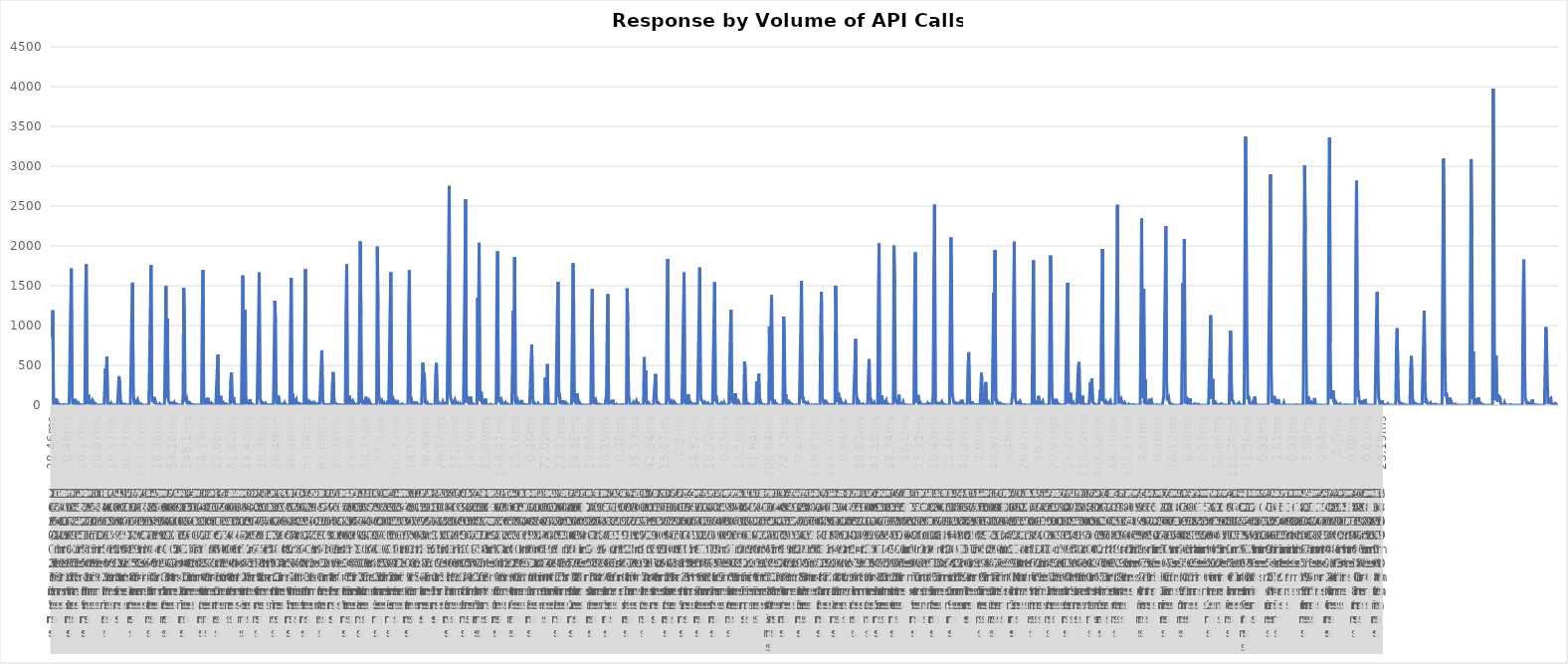
| Category | Number of Calls |
|---|---|
| 0 | 860 |
| 1 | 1191 |
| 2 | 26 |
| 3 | 37 |
| 4 | 39 |
| 5 | 9 |
| 6 | 81 |
| 7 | 19 |
| 8 | 1 |
| 9 | 22 |
| 10 | 27 |
| 11 | 3 |
| 12 | 1 |
| 13 | 3 |
| 14 | 8 |
| 15 | 4 |
| 16 | 1 |
| 17 | 9 |
| 18 | 4 |
| 19 | 1 |
| 20 | 1 |
| 21 | 1 |
| 22 | 1 |
| 23 | 1 |
| 24 | 43 |
| 25 | 48 |
| 26 | 1187 |
| 27 | 1716 |
| 28 | 130 |
| 29 | 8 |
| 30 | 33 |
| 31 | 8 |
| 32 | 78 |
| 33 | 14 |
| 34 | 31 |
| 35 | 1 |
| 36 | 13 |
| 37 | 27 |
| 38 | 5 |
| 39 | 5 |
| 40 | 6 |
| 41 | 1 |
| 42 | 2 |
| 43 | 1 |
| 44 | 1 |
| 45 | 1 |
| 46 | 2 |
| 47 | 1304 |
| 48 | 1770 |
| 49 | 12 |
| 50 | 17 |
| 51 | 132 |
| 52 | 77 |
| 53 | 34 |
| 54 | 2 |
| 55 | 4 |
| 56 | 47 |
| 57 | 1 |
| 58 | 39 |
| 59 | 18 |
| 60 | 1 |
| 61 | 19 |
| 62 | 12 |
| 63 | 3 |
| 64 | 1 |
| 65 | 1 |
| 66 | 9 |
| 67 | 1 |
| 68 | 1 |
| 69 | 4 |
| 70 | 1 |
| 71 | 1 |
| 72 | 1 |
| 73 | 1 |
| 74 | 1 |
| 75 | 460 |
| 76 | 123 |
| 77 | 610 |
| 78 | 22 |
| 79 | 27 |
| 80 | 21 |
| 81 | 17 |
| 82 | 1 |
| 83 | 23 |
| 84 | 5 |
| 85 | 3 |
| 86 | 4 |
| 87 | 4 |
| 88 | 4 |
| 89 | 1 |
| 90 | 1 |
| 91 | 2 |
| 92 | 1 |
| 93 | 7 |
| 94 | 364 |
| 95 | 281 |
| 96 | 82 |
| 97 | 1 |
| 98 | 25 |
| 99 | 26 |
| 100 | 1 |
| 101 | 1 |
| 102 | 13 |
| 103 | 1 |
| 104 | 5 |
| 105 | 1 |
| 106 | 4 |
| 107 | 7 |
| 108 | 3 |
| 109 | 1 |
| 110 | 1 |
| 111 | 1 |
| 112 | 1150 |
| 113 | 1539 |
| 114 | 156 |
| 115 | 68 |
| 116 | 12 |
| 117 | 13 |
| 118 | 4 |
| 119 | 53 |
| 120 | 69 |
| 121 | 11 |
| 122 | 28 |
| 123 | 7 |
| 124 | 5 |
| 125 | 15 |
| 126 | 1 |
| 127 | 1 |
| 128 | 2 |
| 129 | 1 |
| 130 | 1 |
| 131 | 3 |
| 132 | 1 |
| 133 | 13 |
| 134 | 2 |
| 135 | 1 |
| 136 | 1 |
| 137 | 1 |
| 138 | 1170 |
| 139 | 1760 |
| 140 | 144 |
| 141 | 40 |
| 142 | 40 |
| 143 | 102 |
| 144 | 20 |
| 145 | 51 |
| 146 | 19 |
| 147 | 29 |
| 148 | 9 |
| 149 | 16 |
| 150 | 1 |
| 151 | 17 |
| 152 | 2 |
| 153 | 1 |
| 154 | 3 |
| 155 | 2 |
| 156 | 1 |
| 157 | 1 |
| 158 | 2 |
| 159 | 2 |
| 160 | 1501 |
| 161 | 88 |
| 162 | 1087 |
| 163 | 93 |
| 164 | 41 |
| 165 | 46 |
| 166 | 15 |
| 167 | 6 |
| 168 | 31 |
| 169 | 35 |
| 170 | 27 |
| 171 | 1 |
| 172 | 28 |
| 173 | 5 |
| 174 | 12 |
| 175 | 15 |
| 176 | 3 |
| 177 | 2 |
| 178 | 2 |
| 179 | 2 |
| 180 | 1 |
| 181 | 1 |
| 182 | 1 |
| 183 | 1 |
| 184 | 115 |
| 185 | 1472 |
| 186 | 1030 |
| 187 | 43 |
| 188 | 45 |
| 189 | 80 |
| 190 | 12 |
| 191 | 52 |
| 192 | 10 |
| 193 | 21 |
| 194 | 26 |
| 195 | 25 |
| 196 | 5 |
| 197 | 3 |
| 198 | 5 |
| 199 | 6 |
| 200 | 4 |
| 201 | 1 |
| 202 | 2 |
| 203 | 2 |
| 204 | 1 |
| 205 | 1 |
| 206 | 2 |
| 207 | 1 |
| 208 | 1 |
| 209 | 1 |
| 210 | 1 |
| 211 | 1181 |
| 212 | 1697 |
| 213 | 56 |
| 214 | 86 |
| 215 | 1 |
| 216 | 58 |
| 217 | 23 |
| 218 | 26 |
| 219 | 92 |
| 220 | 17 |
| 221 | 32 |
| 222 | 22 |
| 223 | 5 |
| 224 | 24 |
| 225 | 19 |
| 226 | 4 |
| 227 | 2 |
| 228 | 1 |
| 229 | 1 |
| 230 | 1 |
| 231 | 2 |
| 232 | 443 |
| 233 | 634 |
| 234 | 14 |
| 235 | 21 |
| 236 | 1 |
| 237 | 116 |
| 238 | 3 |
| 239 | 2 |
| 240 | 5 |
| 241 | 29 |
| 242 | 27 |
| 243 | 7 |
| 244 | 9 |
| 245 | 15 |
| 246 | 2 |
| 247 | 1 |
| 248 | 1 |
| 249 | 1 |
| 250 | 2 |
| 251 | 313 |
| 252 | 411 |
| 253 | 28 |
| 254 | 27 |
| 255 | 101 |
| 256 | 15 |
| 257 | 5 |
| 258 | 4 |
| 259 | 7 |
| 260 | 4 |
| 261 | 7 |
| 262 | 2 |
| 263 | 4 |
| 264 | 1 |
| 265 | 1 |
| 266 | 1 |
| 267 | 1 |
| 268 | 1629 |
| 269 | 1 |
| 270 | 1 |
| 271 | 1199 |
| 272 | 164 |
| 273 | 31 |
| 274 | 35 |
| 275 | 29 |
| 276 | 13 |
| 277 | 11 |
| 278 | 73 |
| 279 | 5 |
| 280 | 25 |
| 281 | 13 |
| 282 | 5 |
| 283 | 6 |
| 284 | 1 |
| 285 | 1 |
| 286 | 1 |
| 287 | 1 |
| 288 | 2 |
| 289 | 1 |
| 290 | 1047 |
| 291 | 1667 |
| 292 | 98 |
| 293 | 87 |
| 294 | 18 |
| 295 | 39 |
| 296 | 48 |
| 297 | 18 |
| 298 | 13 |
| 299 | 10 |
| 300 | 24 |
| 301 | 9 |
| 302 | 9 |
| 303 | 5 |
| 304 | 2 |
| 305 | 1 |
| 306 | 5 |
| 307 | 5 |
| 308 | 1 |
| 309 | 1 |
| 310 | 1 |
| 311 | 2 |
| 312 | 1 |
| 313 | 1310 |
| 314 | 1023 |
| 315 | 39 |
| 316 | 39 |
| 317 | 13 |
| 318 | 119 |
| 319 | 51 |
| 320 | 19 |
| 321 | 23 |
| 322 | 4 |
| 323 | 9 |
| 324 | 16 |
| 325 | 5 |
| 326 | 3 |
| 327 | 26 |
| 328 | 4 |
| 329 | 3 |
| 330 | 1 |
| 331 | 1 |
| 332 | 1 |
| 333 | 1 |
| 334 | 1 |
| 335 | 980 |
| 336 | 1597 |
| 337 | 4 |
| 338 | 145 |
| 339 | 75 |
| 340 | 14 |
| 341 | 35 |
| 342 | 27 |
| 343 | 69 |
| 344 | 1 |
| 345 | 10 |
| 346 | 7 |
| 347 | 23 |
| 348 | 23 |
| 349 | 15 |
| 350 | 2 |
| 351 | 1 |
| 352 | 5 |
| 353 | 6 |
| 354 | 4 |
| 355 | 1001 |
| 356 | 1708 |
| 357 | 2 |
| 358 | 72 |
| 359 | 56 |
| 360 | 13 |
| 361 | 9 |
| 362 | 41 |
| 363 | 51 |
| 364 | 1 |
| 365 | 1 |
| 366 | 30 |
| 367 | 35 |
| 368 | 6 |
| 369 | 26 |
| 370 | 6 |
| 371 | 2 |
| 372 | 1 |
| 373 | 14 |
| 374 | 1 |
| 375 | 1 |
| 376 | 1 |
| 377 | 1 |
| 378 | 458 |
| 379 | 689 |
| 380 | 106 |
| 381 | 27 |
| 382 | 30 |
| 383 | 5 |
| 384 | 13 |
| 385 | 7 |
| 386 | 12 |
| 387 | 5 |
| 388 | 13 |
| 389 | 10 |
| 390 | 4 |
| 391 | 3 |
| 392 | 2 |
| 393 | 3 |
| 394 | 279 |
| 395 | 416 |
| 396 | 105 |
| 397 | 25 |
| 398 | 17 |
| 399 | 21 |
| 400 | 3 |
| 401 | 4 |
| 402 | 6 |
| 403 | 6 |
| 404 | 1 |
| 405 | 5 |
| 406 | 5 |
| 407 | 6 |
| 408 | 1 |
| 409 | 1 |
| 410 | 1 |
| 411 | 1 |
| 412 | 1 |
| 413 | 1173 |
| 414 | 1768 |
| 415 | 4 |
| 416 | 35 |
| 417 | 37 |
| 418 | 119 |
| 419 | 22 |
| 420 | 7 |
| 421 | 68 |
| 422 | 4 |
| 423 | 44 |
| 424 | 26 |
| 425 | 1 |
| 426 | 9 |
| 427 | 4 |
| 428 | 3 |
| 429 | 15 |
| 430 | 3 |
| 431 | 1 |
| 432 | 3 |
| 433 | 2056 |
| 434 | 1133 |
| 435 | 25 |
| 436 | 61 |
| 437 | 17 |
| 438 | 32 |
| 439 | 64 |
| 440 | 6 |
| 441 | 105 |
| 442 | 5 |
| 443 | 5 |
| 444 | 45 |
| 445 | 11 |
| 446 | 45 |
| 447 | 33 |
| 448 | 1 |
| 449 | 3 |
| 450 | 2 |
| 451 | 1 |
| 452 | 1 |
| 453 | 1 |
| 454 | 2 |
| 455 | 1 |
| 456 | 3 |
| 457 | 1991 |
| 458 | 1180 |
| 459 | 139 |
| 460 | 82 |
| 461 | 29 |
| 462 | 38 |
| 463 | 56 |
| 464 | 10 |
| 465 | 55 |
| 466 | 16 |
| 467 | 3 |
| 468 | 15 |
| 469 | 10 |
| 470 | 24 |
| 471 | 2 |
| 472 | 2 |
| 473 | 4 |
| 474 | 3 |
| 475 | 1212 |
| 476 | 1669 |
| 477 | 4 |
| 478 | 124 |
| 479 | 39 |
| 480 | 12 |
| 481 | 48 |
| 482 | 54 |
| 483 | 10 |
| 484 | 2 |
| 485 | 64 |
| 486 | 8 |
| 487 | 13 |
| 488 | 2 |
| 489 | 1 |
| 490 | 4 |
| 491 | 12 |
| 492 | 14 |
| 493 | 4 |
| 494 | 1 |
| 495 | 2 |
| 496 | 1 |
| 497 | 3 |
| 498 | 1 |
| 499 | 1 |
| 500 | 1 |
| 501 | 1244 |
| 502 | 1693 |
| 503 | 149 |
| 504 | 51 |
| 505 | 65 |
| 506 | 16 |
| 507 | 29 |
| 508 | 36 |
| 509 | 6 |
| 510 | 25 |
| 511 | 11 |
| 512 | 44 |
| 513 | 1 |
| 514 | 10 |
| 515 | 5 |
| 516 | 1 |
| 517 | 1 |
| 518 | 1 |
| 519 | 1 |
| 520 | 1 |
| 521 | 533 |
| 522 | 130 |
| 523 | 411 |
| 524 | 35 |
| 525 | 33 |
| 526 | 16 |
| 527 | 32 |
| 528 | 17 |
| 529 | 6 |
| 530 | 1 |
| 531 | 1 |
| 532 | 9 |
| 533 | 4 |
| 534 | 2 |
| 535 | 1 |
| 536 | 1 |
| 537 | 1 |
| 538 | 1 |
| 539 | 395 |
| 540 | 530 |
| 541 | 119 |
| 542 | 4 |
| 543 | 46 |
| 544 | 3 |
| 545 | 3 |
| 546 | 3 |
| 547 | 1 |
| 548 | 3 |
| 549 | 39 |
| 550 | 12 |
| 551 | 14 |
| 552 | 21 |
| 553 | 1 |
| 554 | 1 |
| 555 | 1 |
| 556 | 1 |
| 557 | 1779 |
| 558 | 2754 |
| 559 | 168 |
| 560 | 90 |
| 561 | 62 |
| 562 | 74 |
| 563 | 3 |
| 564 | 21 |
| 565 | 42 |
| 566 | 67 |
| 567 | 40 |
| 568 | 1 |
| 569 | 12 |
| 570 | 24 |
| 571 | 1 |
| 572 | 1 |
| 573 | 22 |
| 574 | 1 |
| 575 | 5 |
| 576 | 3 |
| 577 | 6 |
| 578 | 4 |
| 579 | 1 |
| 580 | 1613 |
| 581 | 2588 |
| 582 | 34 |
| 583 | 114 |
| 584 | 65 |
| 585 | 65 |
| 586 | 12 |
| 587 | 28 |
| 588 | 109 |
| 589 | 18 |
| 590 | 19 |
| 591 | 20 |
| 592 | 30 |
| 593 | 6 |
| 594 | 6 |
| 595 | 2 |
| 596 | 3 |
| 597 | 6 |
| 598 | 1351 |
| 599 | 136 |
| 600 | 2039 |
| 601 | 77 |
| 602 | 48 |
| 603 | 168 |
| 604 | 44 |
| 605 | 14 |
| 606 | 22 |
| 607 | 15 |
| 608 | 51 |
| 609 | 81 |
| 610 | 1 |
| 611 | 12 |
| 612 | 3 |
| 613 | 7 |
| 614 | 1 |
| 615 | 5 |
| 616 | 10 |
| 617 | 1 |
| 618 | 1 |
| 619 | 1 |
| 620 | 1 |
| 621 | 1 |
| 622 | 1 |
| 623 | 1 |
| 624 | 1 |
| 625 | 1409 |
| 626 | 1932 |
| 627 | 160 |
| 628 | 35 |
| 629 | 37 |
| 630 | 101 |
| 631 | 9 |
| 632 | 49 |
| 633 | 22 |
| 634 | 1 |
| 635 | 2 |
| 636 | 16 |
| 637 | 31 |
| 638 | 1 |
| 639 | 4 |
| 640 | 15 |
| 641 | 16 |
| 642 | 2 |
| 643 | 1 |
| 644 | 4 |
| 645 | 1 |
| 646 | 1 |
| 647 | 1 |
| 648 | 1181 |
| 649 | 142 |
| 650 | 1863 |
| 651 | 56 |
| 652 | 16 |
| 653 | 23 |
| 654 | 60 |
| 655 | 24 |
| 656 | 15 |
| 657 | 10 |
| 658 | 54 |
| 659 | 5 |
| 660 | 64 |
| 661 | 2 |
| 662 | 1 |
| 663 | 5 |
| 664 | 4 |
| 665 | 5 |
| 666 | 1 |
| 667 | 6 |
| 668 | 1 |
| 669 | 1 |
| 670 | 2 |
| 671 | 1 |
| 672 | 1 |
| 673 | 530 |
| 674 | 761 |
| 675 | 147 |
| 676 | 34 |
| 677 | 10 |
| 678 | 26 |
| 679 | 14 |
| 680 | 5 |
| 681 | 5 |
| 682 | 2 |
| 683 | 22 |
| 684 | 9 |
| 685 | 1 |
| 686 | 1 |
| 687 | 4 |
| 688 | 1 |
| 689 | 3 |
| 690 | 1 |
| 691 | 1 |
| 692 | 3 |
| 693 | 344 |
| 694 | 20 |
| 695 | 96 |
| 696 | 515 |
| 697 | 4 |
| 698 | 21 |
| 699 | 13 |
| 700 | 9 |
| 701 | 9 |
| 702 | 6 |
| 703 | 3 |
| 704 | 6 |
| 705 | 13 |
| 706 | 1 |
| 707 | 2 |
| 708 | 1 |
| 709 | 1 |
| 710 | 1226 |
| 711 | 1549 |
| 712 | 105 |
| 713 | 149 |
| 714 | 32 |
| 715 | 27 |
| 716 | 31 |
| 717 | 4 |
| 718 | 60 |
| 719 | 50 |
| 720 | 11 |
| 721 | 7 |
| 722 | 32 |
| 723 | 19 |
| 724 | 3 |
| 725 | 2 |
| 726 | 2 |
| 727 | 1 |
| 728 | 1 |
| 729 | 1 |
| 730 | 1 |
| 731 | 1 |
| 732 | 1781 |
| 733 | 1222 |
| 734 | 53 |
| 735 | 47 |
| 736 | 27 |
| 737 | 89 |
| 738 | 147 |
| 739 | 34 |
| 740 | 17 |
| 741 | 34 |
| 742 | 18 |
| 743 | 2 |
| 744 | 9 |
| 745 | 3 |
| 746 | 12 |
| 747 | 2 |
| 748 | 1 |
| 749 | 1 |
| 750 | 1 |
| 751 | 1 |
| 752 | 1 |
| 753 | 1 |
| 754 | 1 |
| 755 | 3 |
| 756 | 2 |
| 757 | 5 |
| 758 | 1027 |
| 759 | 1458 |
| 760 | 149 |
| 761 | 18 |
| 762 | 61 |
| 763 | 38 |
| 764 | 58 |
| 765 | 14 |
| 766 | 20 |
| 767 | 12 |
| 768 | 13 |
| 769 | 12 |
| 770 | 6 |
| 771 | 1 |
| 772 | 2 |
| 773 | 2 |
| 774 | 4 |
| 775 | 1 |
| 776 | 1 |
| 777 | 2 |
| 778 | 1 |
| 779 | 135 |
| 780 | 974 |
| 781 | 1393 |
| 782 | 12 |
| 783 | 26 |
| 784 | 28 |
| 785 | 42 |
| 786 | 43 |
| 787 | 29 |
| 788 | 69 |
| 789 | 4 |
| 790 | 9 |
| 791 | 1 |
| 792 | 4 |
| 793 | 12 |
| 794 | 3 |
| 795 | 3 |
| 796 | 8 |
| 797 | 1 |
| 798 | 1 |
| 799 | 1 |
| 800 | 1 |
| 801 | 9 |
| 802 | 2 |
| 803 | 2 |
| 804 | 1 |
| 805 | 1 |
| 806 | 1 |
| 807 | 1 |
| 808 | 1465 |
| 809 | 1058 |
| 810 | 145 |
| 811 | 66 |
| 812 | 9 |
| 813 | 3 |
| 814 | 3 |
| 815 | 2 |
| 816 | 7 |
| 817 | 36 |
| 818 | 38 |
| 819 | 7 |
| 820 | 4 |
| 821 | 51 |
| 822 | 13 |
| 823 | 16 |
| 824 | 23 |
| 825 | 1 |
| 826 | 1 |
| 827 | 1 |
| 828 | 1 |
| 829 | 1 |
| 830 | 1 |
| 831 | 1 |
| 832 | 602 |
| 833 | 115 |
| 834 | 434 |
| 835 | 42 |
| 836 | 9 |
| 837 | 5 |
| 838 | 31 |
| 839 | 11 |
| 840 | 23 |
| 841 | 2 |
| 842 | 1 |
| 843 | 1 |
| 844 | 1 |
| 845 | 5 |
| 846 | 7 |
| 847 | 280 |
| 848 | 391 |
| 849 | 96 |
| 850 | 27 |
| 851 | 22 |
| 852 | 30 |
| 853 | 12 |
| 854 | 1 |
| 855 | 4 |
| 856 | 1 |
| 857 | 1 |
| 858 | 1 |
| 859 | 1 |
| 860 | 1 |
| 861 | 1 |
| 862 | 2 |
| 863 | 3 |
| 864 | 1196 |
| 865 | 1836 |
| 866 | 141 |
| 867 | 68 |
| 868 | 30 |
| 869 | 39 |
| 870 | 50 |
| 871 | 8 |
| 872 | 6 |
| 873 | 36 |
| 874 | 12 |
| 875 | 32 |
| 876 | 33 |
| 877 | 3 |
| 878 | 3 |
| 879 | 3 |
| 880 | 5 |
| 881 | 1 |
| 882 | 1 |
| 883 | 2 |
| 884 | 1 |
| 885 | 2 |
| 886 | 1 |
| 887 | 1097 |
| 888 | 1667 |
| 889 | 48 |
| 890 | 58 |
| 891 | 5 |
| 892 | 62 |
| 893 | 9 |
| 894 | 138 |
| 895 | 12 |
| 896 | 17 |
| 897 | 41 |
| 898 | 33 |
| 899 | 17 |
| 900 | 5 |
| 901 | 1 |
| 902 | 3 |
| 903 | 16 |
| 904 | 5 |
| 905 | 1 |
| 906 | 1 |
| 907 | 1 |
| 908 | 2 |
| 909 | 1104 |
| 910 | 1729 |
| 911 | 174 |
| 912 | 69 |
| 913 | 65 |
| 914 | 48 |
| 915 | 22 |
| 916 | 12 |
| 917 | 38 |
| 918 | 1 |
| 919 | 22 |
| 920 | 13 |
| 921 | 3 |
| 922 | 23 |
| 923 | 33 |
| 924 | 1 |
| 925 | 1 |
| 926 | 6 |
| 927 | 3 |
| 928 | 7 |
| 929 | 1 |
| 930 | 1045 |
| 931 | 1545 |
| 932 | 51 |
| 933 | 119 |
| 934 | 32 |
| 935 | 36 |
| 936 | 9 |
| 937 | 7 |
| 938 | 3 |
| 939 | 13 |
| 940 | 27 |
| 941 | 3 |
| 942 | 11 |
| 943 | 11 |
| 944 | 32 |
| 945 | 1 |
| 946 | 6 |
| 947 | 2 |
| 948 | 7 |
| 949 | 1 |
| 950 | 1 |
| 951 | 2 |
| 952 | 1 |
| 953 | 896 |
| 954 | 1196 |
| 955 | 70 |
| 956 | 24 |
| 957 | 50 |
| 958 | 37 |
| 959 | 1 |
| 960 | 148 |
| 961 | 8 |
| 962 | 20 |
| 963 | 41 |
| 964 | 8 |
| 965 | 35 |
| 966 | 9 |
| 967 | 9 |
| 968 | 1 |
| 969 | 1 |
| 970 | 1 |
| 971 | 1 |
| 972 | 1 |
| 973 | 546 |
| 974 | 421 |
| 975 | 105 |
| 976 | 7 |
| 977 | 24 |
| 978 | 18 |
| 979 | 19 |
| 980 | 11 |
| 981 | 1 |
| 982 | 1 |
| 983 | 1 |
| 984 | 9 |
| 985 | 6 |
| 986 | 5 |
| 987 | 1 |
| 988 | 1 |
| 989 | 1 |
| 990 | 300 |
| 991 | 30 |
| 992 | 110 |
| 993 | 393 |
| 994 | 27 |
| 995 | 2 |
| 996 | 36 |
| 997 | 10 |
| 998 | 1 |
| 999 | 1 |
| 1000 | 1 |
| 1001 | 7 |
| 1002 | 6 |
| 1003 | 3 |
| 1004 | 1 |
| 1005 | 1 |
| 1006 | 1 |
| 1007 | 1 |
| 1008 | 987 |
| 1009 | 53 |
| 1010 | 48 |
| 1011 | 1380 |
| 1012 | 124 |
| 1013 | 9 |
| 1014 | 30 |
| 1015 | 66 |
| 1016 | 24 |
| 1017 | 17 |
| 1018 | 20 |
| 1019 | 4 |
| 1020 | 2 |
| 1021 | 1 |
| 1022 | 10 |
| 1023 | 1 |
| 1024 | 7 |
| 1025 | 1 |
| 1026 | 3 |
| 1027 | 4 |
| 1028 | 1112 |
| 1029 | 786 |
| 1030 | 41 |
| 1031 | 137 |
| 1032 | 21 |
| 1033 | 27 |
| 1034 | 42 |
| 1035 | 26 |
| 1036 | 41 |
| 1037 | 29 |
| 1038 | 10 |
| 1039 | 3 |
| 1040 | 14 |
| 1041 | 3 |
| 1042 | 1 |
| 1043 | 1 |
| 1044 | 1 |
| 1045 | 4 |
| 1046 | 3 |
| 1047 | 1 |
| 1048 | 1 |
| 1049 | 1 |
| 1050 | 1 |
| 1051 | 1 |
| 1052 | 986 |
| 1053 | 1558 |
| 1054 | 77 |
| 1055 | 103 |
| 1056 | 38 |
| 1057 | 37 |
| 1058 | 41 |
| 1059 | 34 |
| 1060 | 14 |
| 1061 | 8 |
| 1062 | 32 |
| 1063 | 7 |
| 1064 | 6 |
| 1065 | 4 |
| 1066 | 6 |
| 1067 | 5 |
| 1068 | 9 |
| 1069 | 1 |
| 1070 | 1 |
| 1071 | 1 |
| 1072 | 2 |
| 1073 | 5 |
| 1074 | 1 |
| 1075 | 4 |
| 1076 | 1 |
| 1077 | 1 |
| 1078 | 1 |
| 1079 | 1 |
| 1080 | 1007 |
| 1081 | 1423 |
| 1082 | 111 |
| 1083 | 68 |
| 1084 | 36 |
| 1085 | 8 |
| 1086 | 36 |
| 1087 | 21 |
| 1088 | 41 |
| 1089 | 45 |
| 1090 | 15 |
| 1091 | 14 |
| 1092 | 3 |
| 1093 | 13 |
| 1094 | 8 |
| 1095 | 4 |
| 1096 | 10 |
| 1097 | 4 |
| 1098 | 1 |
| 1099 | 1 |
| 1100 | 1 |
| 1101 | 1501 |
| 1102 | 1075 |
| 1103 | 40 |
| 1104 | 49 |
| 1105 | 157 |
| 1106 | 24 |
| 1107 | 17 |
| 1108 | 55 |
| 1109 | 4 |
| 1110 | 29 |
| 1111 | 32 |
| 1112 | 5 |
| 1113 | 1 |
| 1114 | 4 |
| 1115 | 33 |
| 1116 | 9 |
| 1117 | 1 |
| 1118 | 1 |
| 1119 | 9 |
| 1120 | 7 |
| 1121 | 1 |
| 1122 | 1 |
| 1123 | 1 |
| 1124 | 1 |
| 1125 | 1 |
| 1126 | 1 |
| 1127 | 1 |
| 1128 | 499 |
| 1129 | 830 |
| 1130 | 152 |
| 1131 | 39 |
| 1132 | 56 |
| 1133 | 17 |
| 1134 | 33 |
| 1135 | 5 |
| 1136 | 2 |
| 1137 | 1 |
| 1138 | 3 |
| 1139 | 17 |
| 1140 | 10 |
| 1141 | 1 |
| 1142 | 3 |
| 1143 | 4 |
| 1144 | 1 |
| 1145 | 2 |
| 1146 | 23 |
| 1147 | 361 |
| 1148 | 577 |
| 1149 | 96 |
| 1150 | 35 |
| 1151 | 51 |
| 1152 | 6 |
| 1153 | 4 |
| 1154 | 17 |
| 1155 | 33 |
| 1156 | 2 |
| 1157 | 3 |
| 1158 | 2 |
| 1159 | 2 |
| 1160 | 1 |
| 1161 | 1290 |
| 1162 | 2030 |
| 1163 | 34 |
| 1164 | 49 |
| 1165 | 7 |
| 1166 | 120 |
| 1167 | 26 |
| 1168 | 10 |
| 1169 | 33 |
| 1170 | 20 |
| 1171 | 9 |
| 1172 | 58 |
| 1173 | 5 |
| 1174 | 20 |
| 1175 | 11 |
| 1176 | 4 |
| 1177 | 1 |
| 1178 | 3 |
| 1179 | 2 |
| 1180 | 4 |
| 1181 | 1 |
| 1182 | 1 |
| 1183 | 2002 |
| 1184 | 1466 |
| 1185 | 78 |
| 1186 | 45 |
| 1187 | 47 |
| 1188 | 12 |
| 1189 | 35 |
| 1190 | 131 |
| 1191 | 21 |
| 1192 | 24 |
| 1193 | 2 |
| 1194 | 13 |
| 1195 | 5 |
| 1196 | 36 |
| 1197 | 1 |
| 1198 | 2 |
| 1199 | 4 |
| 1200 | 6 |
| 1201 | 4 |
| 1202 | 1 |
| 1203 | 1 |
| 1204 | 1 |
| 1205 | 1 |
| 1206 | 1 |
| 1207 | 1 |
| 1208 | 1 |
| 1209 | 1 |
| 1210 | 1 |
| 1211 | 1 |
| 1212 | 1417 |
| 1213 | 1920 |
| 1214 | 33 |
| 1215 | 25 |
| 1216 | 70 |
| 1217 | 127 |
| 1218 | 6 |
| 1219 | 50 |
| 1220 | 53 |
| 1221 | 17 |
| 1222 | 25 |
| 1223 | 1 |
| 1224 | 1 |
| 1225 | 8 |
| 1226 | 3 |
| 1227 | 2 |
| 1228 | 2 |
| 1229 | 9 |
| 1230 | 24 |
| 1231 | 1 |
| 1232 | 37 |
| 1233 | 1 |
| 1234 | 7 |
| 1235 | 1 |
| 1236 | 1 |
| 1237 | 1 |
| 1238 | 150 |
| 1239 | 1654 |
| 1240 | 2518 |
| 1241 | 90 |
| 1242 | 7 |
| 1243 | 33 |
| 1244 | 31 |
| 1245 | 21 |
| 1246 | 2 |
| 1247 | 13 |
| 1248 | 23 |
| 1249 | 25 |
| 1250 | 45 |
| 1251 | 1 |
| 1252 | 17 |
| 1253 | 4 |
| 1254 | 4 |
| 1255 | 7 |
| 1256 | 1 |
| 1257 | 1 |
| 1258 | 1 |
| 1259 | 1 |
| 1260 | 1 |
| 1261 | 1 |
| 1262 | 1 |
| 1263 | 2106 |
| 1264 | 1413 |
| 1265 | 141 |
| 1266 | 144 |
| 1267 | 33 |
| 1268 | 3 |
| 1269 | 3 |
| 1270 | 7 |
| 1271 | 29 |
| 1272 | 39 |
| 1273 | 22 |
| 1274 | 11 |
| 1275 | 1 |
| 1276 | 2 |
| 1277 | 52 |
| 1278 | 61 |
| 1279 | 54 |
| 1280 | 21 |
| 1281 | 1 |
| 1282 | 4 |
| 1283 | 2 |
| 1284 | 3 |
| 1285 | 1 |
| 1286 | 23 |
| 1287 | 479 |
| 1288 | 664 |
| 1289 | 145 |
| 1290 | 18 |
| 1291 | 1 |
| 1292 | 19 |
| 1293 | 47 |
| 1294 | 3 |
| 1295 | 4 |
| 1296 | 7 |
| 1297 | 4 |
| 1298 | 7 |
| 1299 | 2 |
| 1300 | 8 |
| 1301 | 1 |
| 1302 | 1 |
| 1303 | 1 |
| 1304 | 1 |
| 1305 | 1 |
| 1306 | 406 |
| 1307 | 82 |
| 1308 | 10 |
| 1309 | 5 |
| 1310 | 6 |
| 1311 | 2 |
| 1312 | 291 |
| 1313 | 24 |
| 1314 | 25 |
| 1315 | 14 |
| 1316 | 32 |
| 1317 | 4 |
| 1318 | 5 |
| 1319 | 3 |
| 1320 | 1 |
| 1321 | 2 |
| 1322 | 1 |
| 1323 | 1413 |
| 1324 | 159 |
| 1325 | 1950 |
| 1326 | 53 |
| 1327 | 81 |
| 1328 | 6 |
| 1329 | 44 |
| 1330 | 14 |
| 1331 | 9 |
| 1332 | 27 |
| 1333 | 33 |
| 1334 | 13 |
| 1335 | 23 |
| 1336 | 4 |
| 1337 | 3 |
| 1338 | 8 |
| 1339 | 1 |
| 1340 | 1 |
| 1341 | 1 |
| 1342 | 1 |
| 1343 | 3 |
| 1344 | 1 |
| 1345 | 1 |
| 1346 | 2 |
| 1347 | 1 |
| 1348 | 1 |
| 1349 | 1 |
| 1350 | 181 |
| 1351 | 1290 |
| 1352 | 2054 |
| 1353 | 116 |
| 1354 | 65 |
| 1355 | 23 |
| 1356 | 3 |
| 1357 | 47 |
| 1358 | 17 |
| 1359 | 30 |
| 1360 | 47 |
| 1361 | 17 |
| 1362 | 23 |
| 1363 | 8 |
| 1364 | 4 |
| 1365 | 3 |
| 1366 | 9 |
| 1367 | 7 |
| 1368 | 1 |
| 1369 | 1 |
| 1370 | 1 |
| 1371 | 1 |
| 1372 | 1 |
| 1373 | 4 |
| 1374 | 1 |
| 1375 | 1 |
| 1376 | 1 |
| 1377 | 1 |
| 1378 | 1148 |
| 1379 | 1820 |
| 1380 | 7 |
| 1381 | 61 |
| 1382 | 10 |
| 1383 | 31 |
| 1384 | 31 |
| 1385 | 18 |
| 1386 | 116 |
| 1387 | 9 |
| 1388 | 34 |
| 1389 | 7 |
| 1390 | 8 |
| 1391 | 36 |
| 1392 | 50 |
| 1393 | 5 |
| 1394 | 1 |
| 1395 | 1 |
| 1396 | 2 |
| 1397 | 4 |
| 1398 | 2 |
| 1399 | 2 |
| 1400 | 1 |
| 1401 | 1 |
| 1402 | 1 |
| 1403 | 1877 |
| 1404 | 1212 |
| 1405 | 147 |
| 1406 | 38 |
| 1407 | 52 |
| 1408 | 19 |
| 1409 | 14 |
| 1410 | 6 |
| 1411 | 80 |
| 1412 | 10 |
| 1413 | 25 |
| 1414 | 32 |
| 1415 | 12 |
| 1416 | 1 |
| 1417 | 1 |
| 1418 | 4 |
| 1419 | 4 |
| 1420 | 1 |
| 1421 | 2 |
| 1422 | 5 |
| 1423 | 1 |
| 1424 | 19 |
| 1425 | 24 |
| 1426 | 1078 |
| 1427 | 1537 |
| 1428 | 22 |
| 1429 | 75 |
| 1430 | 48 |
| 1431 | 154 |
| 1432 | 37 |
| 1433 | 11 |
| 1434 | 9 |
| 1435 | 35 |
| 1436 | 8 |
| 1437 | 17 |
| 1438 | 1 |
| 1439 | 2 |
| 1440 | 1 |
| 1441 | 1 |
| 1442 | 476 |
| 1443 | 542 |
| 1444 | 39 |
| 1445 | 42 |
| 1446 | 11 |
| 1447 | 27 |
| 1448 | 119 |
| 1449 | 6 |
| 1450 | 6 |
| 1451 | 4 |
| 1452 | 8 |
| 1453 | 8 |
| 1454 | 1 |
| 1455 | 1 |
| 1456 | 1 |
| 1457 | 1 |
| 1458 | 1 |
| 1459 | 283 |
| 1460 | 80 |
| 1461 | 334 |
| 1462 | 39 |
| 1463 | 48 |
| 1464 | 24 |
| 1465 | 3 |
| 1466 | 8 |
| 1467 | 6 |
| 1468 | 1 |
| 1469 | 2 |
| 1470 | 8 |
| 1471 | 1 |
| 1472 | 1 |
| 1473 | 192 |
| 1474 | 49 |
| 1475 | 1311 |
| 1476 | 1962 |
| 1477 | 94 |
| 1478 | 51 |
| 1479 | 36 |
| 1480 | 12 |
| 1481 | 35 |
| 1482 | 1 |
| 1483 | 7 |
| 1484 | 20 |
| 1485 | 1 |
| 1486 | 42 |
| 1487 | 56 |
| 1488 | 1 |
| 1489 | 5 |
| 1490 | 3 |
| 1491 | 1 |
| 1492 | 2 |
| 1493 | 8 |
| 1494 | 1 |
| 1495 | 1 |
| 1496 | 1381 |
| 1497 | 2516 |
| 1498 | 306 |
| 1499 | 20 |
| 1500 | 54 |
| 1501 | 62 |
| 1502 | 82 |
| 1503 | 43 |
| 1504 | 25 |
| 1505 | 9 |
| 1506 | 2 |
| 1507 | 34 |
| 1508 | 46 |
| 1509 | 1 |
| 1510 | 1 |
| 1511 | 1 |
| 1512 | 5 |
| 1513 | 15 |
| 1514 | 5 |
| 1515 | 1 |
| 1516 | 1 |
| 1517 | 1 |
| 1518 | 1 |
| 1519 | 7 |
| 1520 | 1 |
| 1521 | 1 |
| 1522 | 1 |
| 1523 | 1 |
| 1524 | 1 |
| 1525 | 1 |
| 1526 | 1 |
| 1527 | 1 |
| 1528 | 1 |
| 1529 | 1 |
| 1530 | 1 |
| 1531 | 2343 |
| 1532 | 95 |
| 1533 | 106 |
| 1534 | 1455 |
| 1535 | 23 |
| 1536 | 325 |
| 1537 | 14 |
| 1538 | 14 |
| 1539 | 2 |
| 1540 | 2 |
| 1541 | 19 |
| 1542 | 80 |
| 1543 | 11 |
| 1544 | 16 |
| 1545 | 50 |
| 1546 | 3 |
| 1547 | 1 |
| 1548 | 1 |
| 1549 | 3 |
| 1550 | 1 |
| 1551 | 1 |
| 1552 | 6 |
| 1553 | 4 |
| 1554 | 3 |
| 1555 | 1 |
| 1556 | 1 |
| 1557 | 1 |
| 1558 | 1 |
| 1559 | 1 |
| 1560 | 1 |
| 1561 | 1 |
| 1562 | 106 |
| 1563 | 116 |
| 1564 | 1487 |
| 1565 | 2247 |
| 1566 | 324 |
| 1567 | 58 |
| 1568 | 64 |
| 1569 | 94 |
| 1570 | 29 |
| 1571 | 15 |
| 1572 | 11 |
| 1573 | 15 |
| 1574 | 15 |
| 1575 | 4 |
| 1576 | 8 |
| 1577 | 2 |
| 1578 | 4 |
| 1579 | 1 |
| 1580 | 1 |
| 1581 | 1 |
| 1582 | 1 |
| 1583 | 1 |
| 1584 | 2 |
| 1585 | 1 |
| 1586 | 1 |
| 1587 | 1 |
| 1588 | 1 |
| 1589 | 1531 |
| 1590 | 409 |
| 1591 | 2083 |
| 1592 | 21 |
| 1593 | 23 |
| 1594 | 105 |
| 1595 | 94 |
| 1596 | 24 |
| 1597 | 1 |
| 1598 | 58 |
| 1599 | 87 |
| 1600 | 5 |
| 1601 | 1 |
| 1602 | 1 |
| 1603 | 4 |
| 1604 | 7 |
| 1605 | 1 |
| 1606 | 18 |
| 1607 | 1 |
| 1608 | 1 |
| 1609 | 4 |
| 1610 | 2 |
| 1611 | 13 |
| 1612 | 2 |
| 1613 | 1 |
| 1614 | 1 |
| 1615 | 1 |
| 1616 | 3 |
| 1617 | 1 |
| 1618 | 1 |
| 1619 | 1 |
| 1620 | 1 |
| 1621 | 1 |
| 1622 | 1 |
| 1623 | 1 |
| 1624 | 2 |
| 1625 | 1 |
| 1626 | 1 |
| 1627 | 723 |
| 1628 | 1129 |
| 1629 | 80 |
| 1630 | 92 |
| 1631 | 328 |
| 1632 | 1 |
| 1633 | 9 |
| 1634 | 57 |
| 1635 | 14 |
| 1636 | 3 |
| 1637 | 12 |
| 1638 | 1 |
| 1639 | 1 |
| 1640 | 1 |
| 1641 | 8 |
| 1642 | 10 |
| 1643 | 18 |
| 1644 | 4 |
| 1645 | 2 |
| 1646 | 1 |
| 1647 | 2 |
| 1648 | 1 |
| 1649 | 1 |
| 1650 | 1 |
| 1651 | 1 |
| 1652 | 1 |
| 1653 | 1 |
| 1654 | 1 |
| 1655 | 667 |
| 1656 | 934 |
| 1657 | 338 |
| 1658 | 68 |
| 1659 | 70 |
| 1660 | 41 |
| 1661 | 8 |
| 1662 | 3 |
| 1663 | 5 |
| 1664 | 1 |
| 1665 | 1 |
| 1666 | 14 |
| 1667 | 1 |
| 1668 | 23 |
| 1669 | 8 |
| 1670 | 1 |
| 1671 | 1 |
| 1672 | 3 |
| 1673 | 1 |
| 1674 | 3 |
| 1675 | 1 |
| 1676 | 1 |
| 1677 | 3372 |
| 1678 | 2335 |
| 1679 | 844 |
| 1680 | 73 |
| 1681 | 117 |
| 1682 | 126 |
| 1683 | 15 |
| 1684 | 20 |
| 1685 | 20 |
| 1686 | 1 |
| 1687 | 29 |
| 1688 | 6 |
| 1689 | 28 |
| 1690 | 107 |
| 1691 | 3 |
| 1692 | 9 |
| 1693 | 2 |
| 1694 | 1 |
| 1695 | 1 |
| 1696 | 1 |
| 1697 | 1 |
| 1698 | 1 |
| 1699 | 1 |
| 1700 | 1 |
| 1701 | 1 |
| 1702 | 2 |
| 1703 | 1 |
| 1704 | 1 |
| 1705 | 1 |
| 1706 | 1 |
| 1707 | 1 |
| 1708 | 1 |
| 1709 | 1 |
| 1710 | 1 |
| 1711 | 1905 |
| 1712 | 2901 |
| 1713 | 522 |
| 1714 | 24 |
| 1715 | 26 |
| 1716 | 105 |
| 1717 | 110 |
| 1718 | 100 |
| 1719 | 1 |
| 1720 | 1 |
| 1721 | 18 |
| 1722 | 34 |
| 1723 | 77 |
| 1724 | 1 |
| 1725 | 1 |
| 1726 | 1 |
| 1727 | 1 |
| 1728 | 1 |
| 1729 | 9 |
| 1730 | 1 |
| 1731 | 30 |
| 1732 | 1 |
| 1733 | 1 |
| 1734 | 1 |
| 1735 | 1 |
| 1736 | 1 |
| 1737 | 1 |
| 1738 | 1 |
| 1739 | 6 |
| 1740 | 1 |
| 1741 | 5 |
| 1742 | 1 |
| 1743 | 1 |
| 1744 | 1 |
| 1745 | 1 |
| 1746 | 1 |
| 1747 | 1 |
| 1748 | 6 |
| 1749 | 1 |
| 1750 | 1 |
| 1751 | 1 |
| 1752 | 1 |
| 1753 | 3 |
| 1754 | 1 |
| 1755 | 1 |
| 1756 | 1 |
| 1757 | 1 |
| 1758 | 1 |
| 1759 | 1 |
| 1760 | 3013 |
| 1761 | 2156 |
| 1762 | 674 |
| 1763 | 2 |
| 1764 | 45 |
| 1765 | 113 |
| 1766 | 111 |
| 1767 | 19 |
| 1768 | 61 |
| 1769 | 1 |
| 1770 | 31 |
| 1771 | 34 |
| 1772 | 6 |
| 1773 | 21 |
| 1774 | 90 |
| 1775 | 1 |
| 1776 | 1 |
| 1777 | 1 |
| 1778 | 1 |
| 1779 | 1 |
| 1780 | 1 |
| 1781 | 3 |
| 1782 | 3 |
| 1783 | 1 |
| 1784 | 1 |
| 1785 | 1 |
| 1786 | 2 |
| 1787 | 1 |
| 1788 | 4 |
| 1789 | 1 |
| 1790 | 2 |
| 1791 | 1 |
| 1792 | 1 |
| 1793 | 1 |
| 1794 | 2424 |
| 1795 | 3363 |
| 1796 | 788 |
| 1797 | 79 |
| 1798 | 79 |
| 1799 | 139 |
| 1800 | 185 |
| 1801 | 48 |
| 1802 | 23 |
| 1803 | 39 |
| 1804 | 6 |
| 1805 | 23 |
| 1806 | 7 |
| 1807 | 4 |
| 1808 | 1 |
| 1809 | 1 |
| 1810 | 18 |
| 1811 | 3 |
| 1812 | 1 |
| 1813 | 1 |
| 1814 | 5 |
| 1815 | 1 |
| 1816 | 1 |
| 1817 | 5 |
| 1818 | 1 |
| 1819 | 1 |
| 1820 | 1 |
| 1821 | 2 |
| 1822 | 1 |
| 1823 | 1 |
| 1824 | 1 |
| 1825 | 1 |
| 1826 | 1 |
| 1827 | 1 |
| 1828 | 1 |
| 1829 | 1 |
| 1830 | 1 |
| 1831 | 1 |
| 1832 | 1995 |
| 1833 | 2820 |
| 1834 | 585 |
| 1835 | 103 |
| 1836 | 123 |
| 1837 | 43 |
| 1838 | 18 |
| 1839 | 16 |
| 1840 | 17 |
| 1841 | 61 |
| 1842 | 31 |
| 1843 | 1 |
| 1844 | 4 |
| 1845 | 76 |
| 1846 | 17 |
| 1847 | 4 |
| 1848 | 1 |
| 1849 | 1 |
| 1850 | 1 |
| 1851 | 2 |
| 1852 | 1 |
| 1853 | 1 |
| 1854 | 1 |
| 1855 | 1 |
| 1856 | 1 |
| 1857 | 1 |
| 1858 | 1 |
| 1859 | 1 |
| 1860 | 1 |
| 1861 | 1145 |
| 1862 | 1423 |
| 1863 | 531 |
| 1864 | 97 |
| 1865 | 105 |
| 1866 | 8 |
| 1867 | 4 |
| 1868 | 26 |
| 1869 | 58 |
| 1870 | 1 |
| 1871 | 1 |
| 1872 | 6 |
| 1873 | 6 |
| 1874 | 6 |
| 1875 | 1 |
| 1876 | 2 |
| 1877 | 17 |
| 1878 | 1 |
| 1879 | 1 |
| 1880 | 1 |
| 1881 | 5 |
| 1882 | 1 |
| 1883 | 1 |
| 1884 | 1 |
| 1885 | 1 |
| 1886 | 1 |
| 1887 | 1 |
| 1888 | 1 |
| 1889 | 731 |
| 1890 | 966 |
| 1891 | 389 |
| 1892 | 75 |
| 1893 | 79 |
| 1894 | 1 |
| 1895 | 6 |
| 1896 | 21 |
| 1897 | 24 |
| 1898 | 16 |
| 1899 | 6 |
| 1900 | 7 |
| 1901 | 6 |
| 1902 | 2 |
| 1903 | 1 |
| 1904 | 1 |
| 1905 | 1 |
| 1906 | 1 |
| 1907 | 1 |
| 1908 | 1 |
| 1909 | 457 |
| 1910 | 617 |
| 1911 | 256 |
| 1912 | 4 |
| 1913 | 44 |
| 1914 | 49 |
| 1915 | 13 |
| 1916 | 1 |
| 1917 | 18 |
| 1918 | 27 |
| 1919 | 7 |
| 1920 | 10 |
| 1921 | 5 |
| 1922 | 5 |
| 1923 | 1 |
| 1924 | 1 |
| 1925 | 6 |
| 1926 | 1 |
| 1927 | 748 |
| 1928 | 1186 |
| 1929 | 361 |
| 1930 | 24 |
| 1931 | 65 |
| 1932 | 73 |
| 1933 | 15 |
| 1934 | 3 |
| 1935 | 1 |
| 1936 | 1 |
| 1937 | 31 |
| 1938 | 17 |
| 1939 | 1 |
| 1940 | 2 |
| 1941 | 2 |
| 1942 | 2 |
| 1943 | 13 |
| 1944 | 17 |
| 1945 | 8 |
| 1946 | 1 |
| 1947 | 1 |
| 1948 | 1 |
| 1949 | 1 |
| 1950 | 1 |
| 1951 | 2 |
| 1952 | 2 |
| 1953 | 1 |
| 1954 | 1 |
| 1955 | 3100 |
| 1956 | 2342 |
| 1957 | 745 |
| 1958 | 111 |
| 1959 | 161 |
| 1960 | 88 |
| 1961 | 7 |
| 1962 | 46 |
| 1963 | 10 |
| 1964 | 93 |
| 1965 | 20 |
| 1966 | 48 |
| 1967 | 54 |
| 1968 | 1 |
| 1969 | 1 |
| 1970 | 4 |
| 1971 | 2 |
| 1972 | 15 |
| 1973 | 5 |
| 1974 | 1 |
| 1975 | 8 |
| 1976 | 1 |
| 1977 | 1 |
| 1978 | 1 |
| 1979 | 1 |
| 1980 | 1 |
| 1981 | 1 |
| 1982 | 1 |
| 1983 | 1 |
| 1984 | 1 |
| 1985 | 1 |
| 1986 | 1 |
| 1987 | 1 |
| 1988 | 1 |
| 1989 | 1 |
| 1990 | 3 |
| 1991 | 1 |
| 1992 | 1 |
| 1993 | 3 |
| 1994 | 3089 |
| 1995 | 2138 |
| 1996 | 80 |
| 1997 | 675 |
| 1998 | 2 |
| 1999 | 2 |
| 2000 | 86 |
| 2001 | 6 |
| 2002 | 38 |
| 2003 | 10 |
| 2004 | 96 |
| 2005 | 84 |
| 2006 | 25 |
| 2007 | 25 |
| 2008 | 23 |
| 2009 | 20 |
| 2010 | 8 |
| 2011 | 3 |
| 2012 | 4 |
| 2013 | 1 |
| 2014 | 1 |
| 2015 | 1 |
| 2016 | 1 |
| 2017 | 1 |
| 2018 | 1 |
| 2019 | 1 |
| 2020 | 1 |
| 2021 | 1 |
| 2022 | 2 |
| 2023 | 1 |
| 2024 | 1 |
| 2025 | 3974 |
| 2026 | 2365 |
| 2027 | 63 |
| 2028 | 52 |
| 2029 | 626 |
| 2030 | 164 |
| 2031 | 42 |
| 2032 | 133 |
| 2033 | 82 |
| 2034 | 108 |
| 2035 | 55 |
| 2036 | 11 |
| 2037 | 5 |
| 2038 | 1 |
| 2039 | 1 |
| 2040 | 1 |
| 2041 | 29 |
| 2042 | 1 |
| 2043 | 1 |
| 2044 | 1 |
| 2045 | 2 |
| 2046 | 1 |
| 2047 | 1 |
| 2048 | 1 |
| 2049 | 1 |
| 2050 | 8 |
| 2051 | 1 |
| 2052 | 1 |
| 2053 | 3 |
| 2054 | 1 |
| 2055 | 1 |
| 2056 | 1 |
| 2057 | 1 |
| 2058 | 1 |
| 2059 | 1 |
| 2060 | 1 |
| 2061 | 1 |
| 2062 | 1 |
| 2063 | 1 |
| 2064 | 1 |
| 2065 | 1 |
| 2066 | 1 |
| 2067 | 1346 |
| 2068 | 1827 |
| 2069 | 565 |
| 2070 | 99 |
| 2071 | 105 |
| 2072 | 20 |
| 2073 | 37 |
| 2074 | 31 |
| 2075 | 30 |
| 2076 | 1 |
| 2077 | 2 |
| 2078 | 1 |
| 2079 | 3 |
| 2080 | 70 |
| 2081 | 17 |
| 2082 | 12 |
| 2083 | 1 |
| 2084 | 1 |
| 2085 | 5 |
| 2086 | 2 |
| 2087 | 4 |
| 2088 | 2 |
| 2089 | 1 |
| 2090 | 1 |
| 2091 | 1 |
| 2092 | 1 |
| 2093 | 1 |
| 2094 | 1 |
| 2095 | 1 |
| 2096 | 1 |
| 2097 | 1 |
| 2098 | 1 |
| 2099 | 980 |
| 2100 | 776 |
| 2101 | 347 |
| 2102 | 18 |
| 2103 | 19 |
| 2104 | 68 |
| 2105 | 78 |
| 2106 | 85 |
| 2107 | 7 |
| 2108 | 1 |
| 2109 | 1 |
| 2110 | 3 |
| 2111 | 17 |
| 2112 | 1 |
| 2113 | 17 |
| 2114 | 14 |
| 2115 | 1 |
| 2116 | 1 |
| 2117 | 1 |